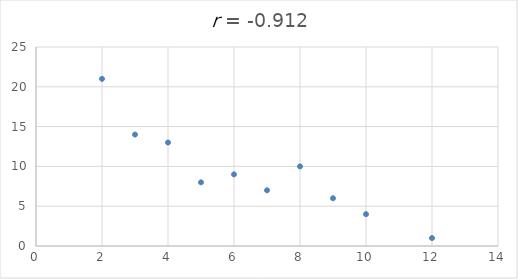
| Category | Series 0 |
|---|---|
| 2.0 | 21 |
| 4.0 | 13 |
| 7.0 | 7 |
| 5.0 | 8 |
| 8.0 | 10 |
| 6.0 | 9 |
| 9.0 | 6 |
| 12.0 | 1 |
| 3.0 | 14 |
| 10.0 | 4 |